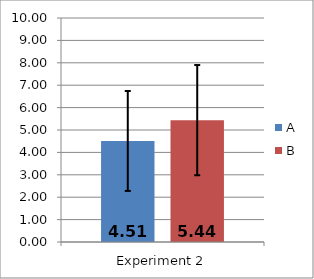
| Category | A | B |
|---|---|---|
| 0 | 4.51 | 5.44 |